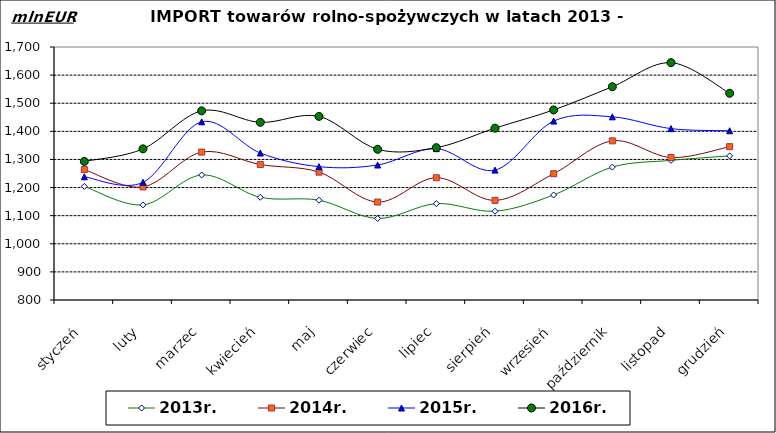
| Category | 2013r. | 2014r. | 2015r. | 2016r. |
|---|---|---|---|---|
| styczeń | 1204.113 | 1263.935 | 1238.318 | 1293.007 |
| luty | 1138.43 | 1202.35 | 1218.563 | 1337.608 |
| marzec | 1244.708 | 1326.132 | 1433.842 | 1472.816 |
| kwiecień | 1165.454 | 1281.827 | 1322.838 | 1431.953 |
| maj | 1154.989 | 1254.78 | 1274.327 | 1453.2 |
| czerwiec | 1090.19 | 1148.455 | 1280.247 | 1336.014 |
| lipiec | 1142.943 | 1235.031 | 1338.433 | 1341.891 |
| sierpień | 1115.834 | 1154.418 | 1262.037 | 1411.388 |
| wrzesień | 1173.738 | 1249.199 | 1436.612 | 1476.147 |
| październik | 1272.754 | 1366.092 | 1451.551 | 1558.699 |
| listopad | 1296.742 | 1306.761 | 1409.66 | 1644.264 |
| grudzień | 1312.673 | 1345.465 | 1401.992 | 1535.407 |